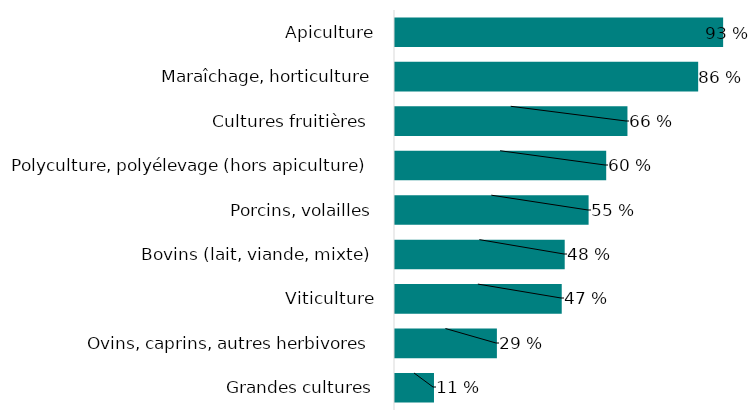
| Category | Part vendant en circuit court selon leur spécialisation |
|---|---|
| Apiculture | 0.932 |
| Maraîchage, horticulture | 0.861 |
| Cultures fruitières  | 0.66 |
| Polyculture, polyélevage (hors apiculture) | 0.6 |
| Porcins, volailles | 0.55 |
| Bovins (lait, viande, mixte) | 0.482 |
| Viticulture | 0.474 |
| Ovins, caprins, autres herbivores | 0.289 |
| Grandes cultures | 0.111 |